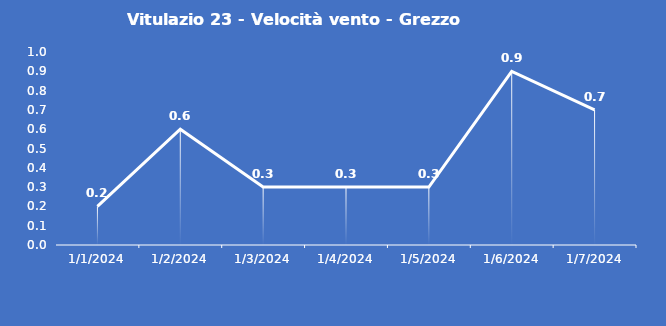
| Category | Vitulazio 23 - Velocità vento - Grezzo (m/s) |
|---|---|
| 1/1/24 | 0.2 |
| 1/2/24 | 0.6 |
| 1/3/24 | 0.3 |
| 1/4/24 | 0.3 |
| 1/5/24 | 0.3 |
| 1/6/24 | 0.9 |
| 1/7/24 | 0.7 |